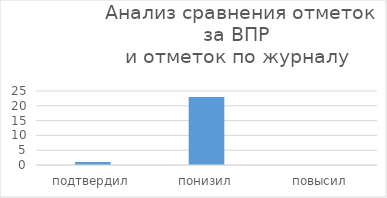
| Category | Series 0 |
|---|---|
| подтвердил | 1 |
| понизил | 23 |
| повысил | 0 |